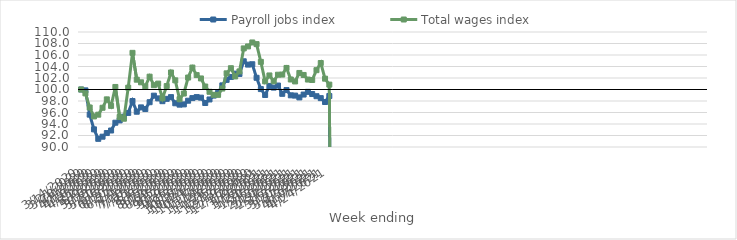
| Category | Payroll jobs index | Total wages index |
|---|---|---|
| 14/03/2020 | 100 | 100 |
| 21/03/2020 | 99.849 | 99.327 |
| 28/03/2020 | 95.627 | 96.871 |
| 04/04/2020 | 93.069 | 95.316 |
| 11/04/2020 | 91.419 | 95.621 |
| 18/04/2020 | 91.791 | 96.822 |
| 25/04/2020 | 92.428 | 98.285 |
| 02/05/2020 | 92.869 | 97.152 |
| 09/05/2020 | 94.224 | 100.442 |
| 16/05/2020 | 94.623 | 95.221 |
| 23/05/2020 | 95.278 | 94.918 |
| 30/05/2020 | 95.924 | 100.318 |
| 06/06/2020 | 97.992 | 106.375 |
| 13/06/2020 | 96.135 | 101.707 |
| 20/06/2020 | 96.889 | 101.248 |
| 27/06/2020 | 96.602 | 100.532 |
| 04/07/2020 | 97.789 | 102.233 |
| 11/07/2020 | 98.927 | 100.75 |
| 18/07/2020 | 98.455 | 101.025 |
| 25/07/2020 | 97.968 | 98.473 |
| 01/08/2020 | 98.377 | 100.597 |
| 08/08/2020 | 98.676 | 102.958 |
| 15/08/2020 | 97.604 | 101.59 |
| 22/08/2020 | 97.366 | 98.317 |
| 29/08/2020 | 97.41 | 99.297 |
| 05/09/2020 | 98.051 | 102.079 |
| 12/09/2020 | 98.504 | 103.816 |
| 19/09/2020 | 98.677 | 102.507 |
| 26/09/2020 | 98.582 | 101.924 |
| 03/10/2020 | 97.65 | 100.515 |
| 10/10/2020 | 98.268 | 99.598 |
| 17/10/2020 | 98.941 | 99.078 |
| 24/10/2020 | 99.415 | 99.067 |
| 31/10/2020 | 100.72 | 100.164 |
| 07/11/2020 | 101.676 | 102.812 |
| 14/11/2020 | 102.184 | 103.702 |
| 21/11/2020 | 102.759 | 102.27 |
| 28/11/2020 | 102.706 | 103.144 |
| 05/12/2020 | 104.908 | 107.146 |
| 12/12/2020 | 104.331 | 107.491 |
| 19/12/2020 | 104.393 | 108.18 |
| 26/12/2020 | 102.036 | 107.894 |
| 02/01/2021 | 100.071 | 104.802 |
| 09/01/2021 | 99.046 | 101.423 |
| 16/01/2021 | 100.621 | 102.444 |
| 23/01/2021 | 100.329 | 101.434 |
| 30/01/2021 | 100.688 | 102.571 |
| 06/02/2021 | 99.248 | 102.598 |
| 13/02/2021 | 99.898 | 103.747 |
| 20/02/2021 | 98.986 | 101.738 |
| 27/02/2021 | 98.939 | 101.404 |
| 06/03/2021 | 98.624 | 102.876 |
| 13/03/2021 | 99.12 | 102.528 |
| 20/03/2021 | 99.59 | 101.731 |
| 27/03/2021 | 99.211 | 101.654 |
| 03/04/2021 | 98.832 | 103.363 |
| 10/04/2021 | 98.497 | 104.605 |
| 17/04/2021 | 97.826 | 101.885 |
| 24/04/2021 | 98.866 | 100.85 |